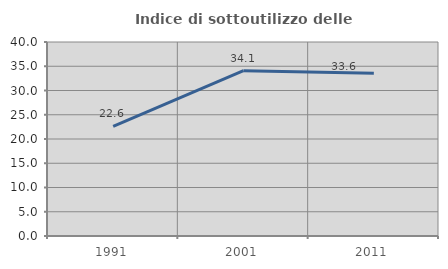
| Category | Indice di sottoutilizzo delle abitazioni  |
|---|---|
| 1991.0 | 22.581 |
| 2001.0 | 34.085 |
| 2011.0 | 33.58 |